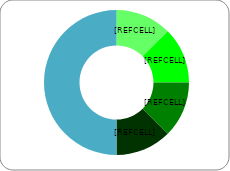
| Category | Series 0 |
|---|---|
| 0 | 0.25 |
| 1 | 0.25 |
| 2 | 0.25 |
| 3 | 0.25 |
| 4 | 1 |